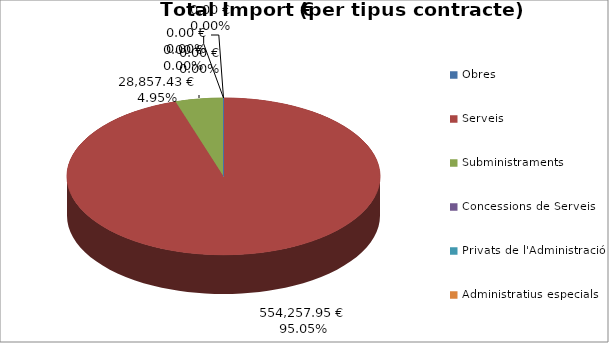
| Category | Total preu              (amb iva) |
|---|---|
| Obres | 0 |
| Serveis | 554257.952 |
| Subministraments | 28857.43 |
| Concessions de Serveis | 0 |
| Privats de l'Administració | 0 |
| Administratius especials | 0 |